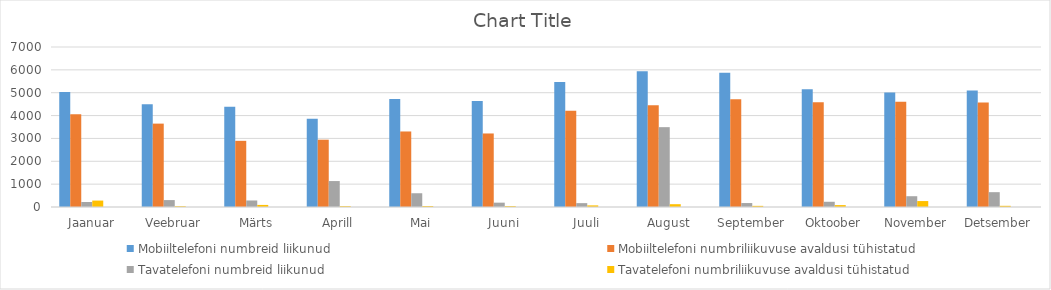
| Category | Mobiiltelefoni numbreid liikunud | Mobiiltelefoni numbriliikuvuse avaldusi tühistatud | Tavatelefoni numbreid liikunud | Tavatelefoni numbriliikuvuse avaldusi tühistatud | Teenusnumbreid liikunud | Teenusnumbrite numbriliikuvuse avaldusi tühistatud |
|---|---|---|---|---|---|---|
| Jaanuar | 5028 | 4059 | 219 | 281 | 0 | 0 |
| Veebruar | 4499 | 3648 | 303 | 34 | 0 | 0 |
| Märts | 4388 | 2895 | 285 | 91 | 0 | 0 |
| Aprill | 3866 | 2945 | 1135 | 37 | 0 | 0 |
| Mai | 4729 | 3304 | 602 | 42 | 0 | 0 |
| Juuni | 4639 | 3217 | 190 | 39 | 0 | 0 |
| Juuli | 5470 | 4207 | 169 | 71 | 0 | 0 |
| August | 5943 | 4457 | 3493 | 123 | 0 | 0 |
| September | 5877 | 4713 | 173 | 50 | 0 | 0 |
| Oktoober | 5156 | 4583 | 229 | 83 | 0 | 0 |
| November | 5006 | 4609 | 472 | 260 | 0 | 0 |
| Detsember | 5096 | 4572 | 649 | 52 | 0 | 0 |